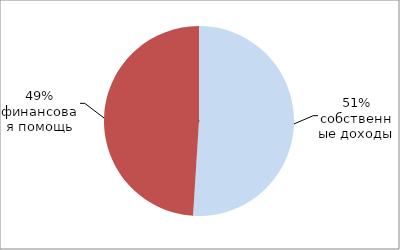
| Category | Series 0 |
|---|---|
| 0 | 0.51 |
| 1 | 0.49 |